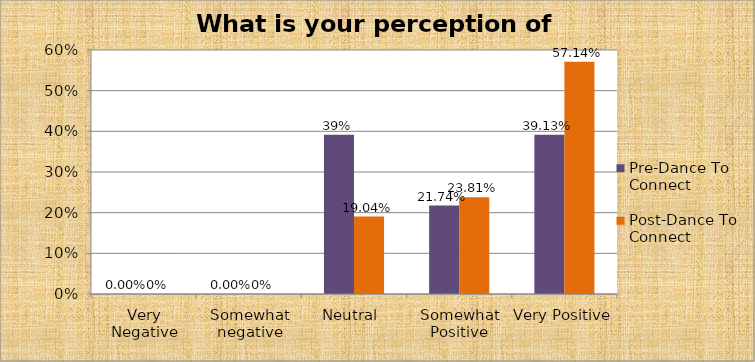
| Category | Pre-Dance To Connect | Post-Dance To Connect |
|---|---|---|
| Very Negative | 0 | 0 |
| Somewhat negative | 0 | 0 |
| Neutral  | 0.391 | 0.19 |
| Somewhat Positive | 0.217 | 0.238 |
| Very Positive | 0.391 | 0.571 |